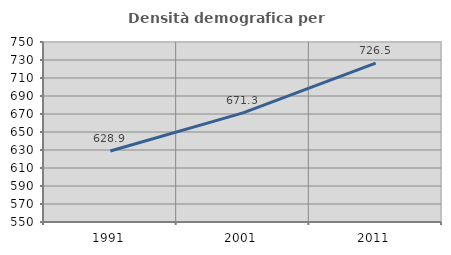
| Category | Densità demografica |
|---|---|
| 1991.0 | 628.937 |
| 2001.0 | 671.267 |
| 2011.0 | 726.453 |